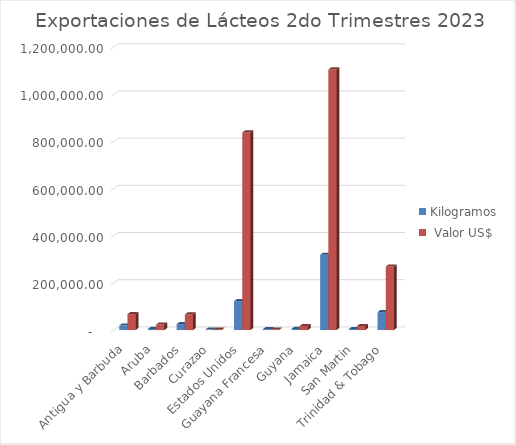
| Category | Kilogramos |  Valor US$ |
|---|---|---|
| Antigua y Barbuda | 18904.03 | 67370.35 |
| Aruba | 4893 | 23528.7 |
| Barbados | 25041.54 | 66026.05 |
| Curazao | 1861.52 | 1420.8 |
| Estados Unidos | 122343.11 | 837582.48 |
| Guayana Francesa | 3600 | 1856 |
| Guyana | 4619.76 | 17203.95 |
| Jamaica | 319121.6 | 1104717.79 |
| San Martin | 3866.97 | 17212.1 |
| Trinidad & Tobago | 75733.94 | 269386.27 |